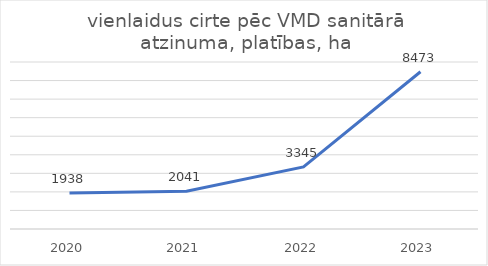
| Category | vienlaidus cirte pēc VMD sanitārā atzinuma, platības, ha |
|---|---|
| 2020.0 | 1938 |
| 2021.0 | 2041 |
| 2022.0 | 3345 |
| 2023.0 | 8473 |